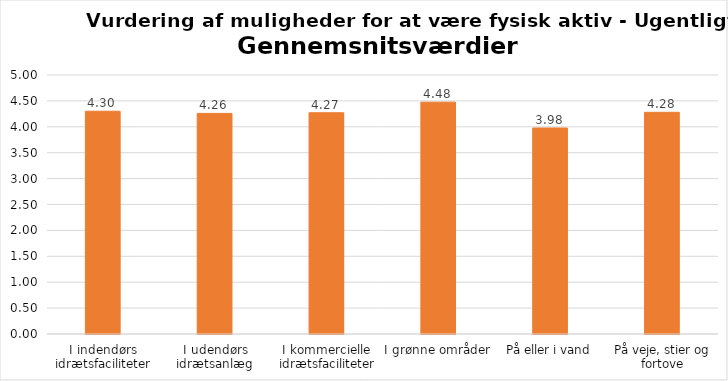
| Category | Gennemsnit |
|---|---|
| I indendørs idrætsfaciliteter | 4.301 |
| I udendørs idrætsanlæg | 4.259 |
| I kommercielle idrætsfaciliteter | 4.271 |
| I grønne områder | 4.476 |
| På eller i vand | 3.977 |
| På veje, stier og fortove | 4.28 |